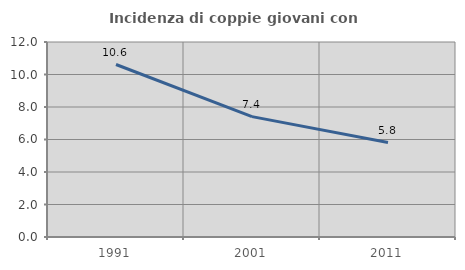
| Category | Incidenza di coppie giovani con figli |
|---|---|
| 1991.0 | 10.615 |
| 2001.0 | 7.407 |
| 2011.0 | 5.814 |